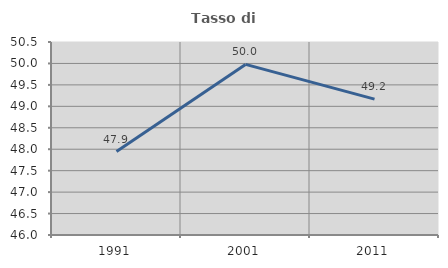
| Category | Tasso di occupazione   |
|---|---|
| 1991.0 | 47.944 |
| 2001.0 | 49.978 |
| 2011.0 | 49.168 |